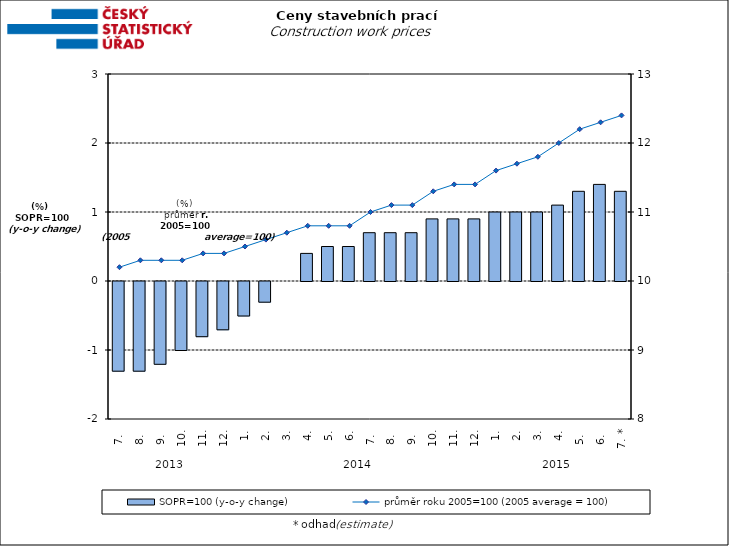
| Category | SOPR=100 (y-o-y change)   |
|---|---|
| 0 | -1.3 |
| 1 | -1.3 |
| 2 | -1.2 |
| 3 | -1 |
| 4 | -0.8 |
| 5 | -0.7 |
| 6 | -0.5 |
| 7 | -0.3 |
| 8 | 0 |
| 9 | 0.4 |
| 10 | 0.5 |
| 11 | 0.5 |
| 12 | 0.7 |
| 13 | 0.7 |
| 14 | 0.7 |
| 15 | 0.9 |
| 16 | 0.9 |
| 17 | 0.9 |
| 18 | 1 |
| 19 | 1 |
| 20 | 1 |
| 21 | 1.1 |
| 22 | 1.3 |
| 23 | 1.4 |
| 24 | 1.3 |